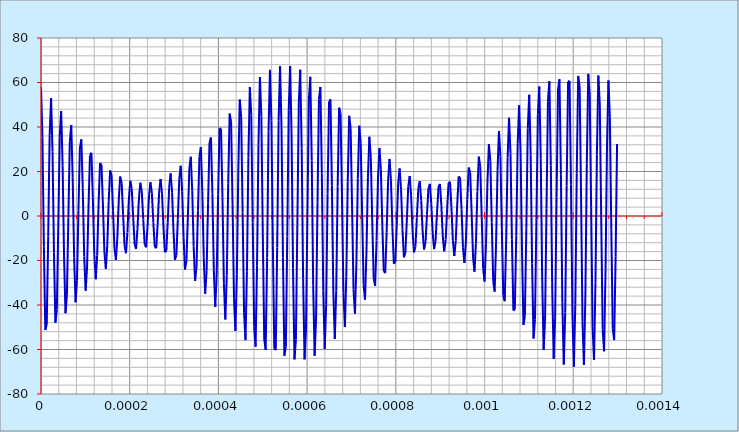
| Category | Series 0 |
|---|---|
| 0.0 | 58.016 |
| 3.246753246753247e-06 | 35.27 |
| 6.493506493506494e-06 | -13.831 |
| 9.74025974025974e-06 | -51.241 |
| 1.2987012987012988e-05 | -48.731 |
| 1.6233766233766234e-05 | -9.201 |
| 1.948051948051948e-05 | 36.301 |
| 2.272727272727273e-05 | 52.983 |
| 2.5974025974025975e-05 | 28.934 |
| 2.9220779220779218e-05 | -16.416 |
| 3.246753246753247e-05 | -47.975 |
| 3.571428571428572e-05 | -42.167 |
| 3.896103896103896e-05 | -4.539 |
| 4.220779220779221e-05 | 35.343 |
| 4.545454545454546e-05 | 47.134 |
| 4.87012987012987e-05 | 22.808 |
| 5.194805194805195e-05 | -17.971 |
| 5.51948051948052e-05 | -43.721 |
| 5.8441558441558436e-05 | -35.454 |
| 6.168831168831169e-05 | -0.658 |
| 6.493506493506494e-05 | 33.341 |
| 6.818181818181818e-05 | 40.838 |
| 7.142857142857143e-05 | 17.176 |
| 7.467532467532468e-05 | -18.529 |
| 7.792207792207792e-05 | -38.8 |
| 8.116883116883117e-05 | -28.945 |
| 8.441558441558442e-05 | 2.344 |
| 8.766233766233767e-05 | 30.534 |
| 9.090909090909092e-05 | 34.477 |
| 9.415584415584415e-05 | 12.254 |
| 9.74025974025974e-05 | -18.213 |
| 0.00010064935064935065 | -33.578 |
| 0.0001038961038961039 | -22.948 |
| 0.00010714285714285715 | 4.466 |
| 0.0001103896103896104 | 27.226 |
| 0.00011363636363636362 | 28.414 |
| 0.00011688311688311687 | 8.169 |
| 0.00012012987012987012 | -17.233 |
| 0.00012337662337662337 | -28.43 |
| 0.00012662337662337663 | -17.7 |
| 0.00012987012987012987 | 5.798 |
| 0.0001331168831168831 | 23.76 |
| 0.00013636363636363637 | 22.964 |
| 0.0001396103896103896 | 4.956 |
| 0.00014285714285714287 | -15.864 |
| 0.0001461038961038961 | -23.711 |
| 0.00014935064935064937 | -13.35 |
| 0.00015259740259740258 | 6.518 |
| 0.00015584415584415584 | 20.492 |
| 0.00015909090909090907 | 18.372 |
| 0.00016233766233766234 | 2.55 |
| 0.0001655844155844156 | -14.418 |
| 0.00016883116883116884 | -19.73 |
| 0.0001720779220779221 | -9.95 |
| 0.00017532467532467534 | 6.866 |
| 0.0001785714285714286 | 17.755 |
| 0.00018181818181818183 | 14.792 |
| 0.00018506493506493504 | 0.804 |
| 0.0001883116883116883 | -13.222 |
| 0.00019155844155844154 | -16.72 |
| 0.0001948051948051948 | -7.454 |
| 0.00019805194805194804 | 7.128 |
| 0.0002012987012987013 | 15.837 |
| 0.00020454545454545454 | 12.279 |
| 0.0002077922077922078 | -0.502 |
| 0.00021103896103896104 | -12.584 |
| 0.0002142857142857143 | -14.825 |
| 0.00021753246753246754 | -5.725 |
| 0.0002207792207792208 | 7.602 |
| 0.000224025974025974 | 14.95 |
| 0.00022727272727272725 | 10.783 |
| 0.0002305194805194805 | -1.631 |
| 0.00023376623376623374 | -12.764 |
| 0.000237012987012987 | -14.084 |
| 0.00024025974025974024 | -4.552 |
| 0.0002435064935064935 | 8.574 |
| 0.00024675324675324674 | 15.216 |
| 0.00025 | 10.164 |
| 0.00025324675324675327 | -2.871 |
| 0.00025649350649350653 | -13.951 |
| 0.00025974025974025974 | -14.435 |
| 0.000262987012987013 | -3.672 |
| 0.0002662337662337662 | 10.284 |
| 0.0002694805194805195 | 16.652 |
| 0.00027272727272727274 | 10.2 |
| 0.00027597402597402595 | -4.495 |
| 0.0002792207792207792 | -16.245 |
| 0.00028246753246753247 | -15.715 |
| 0.00028571428571428574 | -2.797 |
| 0.00028896103896103894 | 12.909 |
| 0.0002922077922077922 | 19.173 |
| 0.00029545454545454547 | 10.614 |
| 0.00029870129870129873 | -6.743 |
| 0.00030194805194805194 | -19.645 |
| 0.00030519480519480515 | -17.683 |
| 0.0003084415584415584 | -1.642 |
| 0.0003116883116883117 | 16.535 |
| 0.00031493506493506494 | 22.592 |
| 0.00031818181818181815 | 11.099 |
| 0.0003214285714285714 | -9.789 |
| 0.0003246753246753247 | -24.045 |
| 0.00032792207792207794 | -20.035 |
| 0.0003311688311688312 | 0.043 |
| 0.0003344155844155844 | 21.153 |
| 0.00033766233766233767 | 26.644 |
| 0.00034090909090909094 | 11.346 |
| 0.0003441558441558442 | -13.726 |
| 0.0003474025974025974 | -29.243 |
| 0.00035064935064935067 | -22.436 |
| 0.00035389610389610393 | 2.452 |
| 0.0003571428571428572 | 26.653 |
| 0.0003603896103896104 | 31.001 |
| 0.00036363636363636367 | 11.078 |
| 0.0003668831168831168 | -18.554 |
| 0.0003701298701298701 | -34.956 |
| 0.00037337662337662335 | -24.549 |
| 0.0003766233766233766 | 5.7 |
| 0.0003798701298701298 | 32.83 |
| 0.0003831168831168831 | 35.3 |
| 0.00038636363636363635 | 10.07 |
| 0.0003896103896103896 | -24.176 |
| 0.0003928571428571428 | -40.84 |
| 0.0003961038961038961 | -26.063 |
| 0.00039935064935064934 | 9.812 |
| 0.0004025974025974026 | 39.4 |
| 0.00040584415584415587 | 39.179 |
| 0.0004090909090909091 | 8.176 |
| 0.00041233766233766234 | -30.4 |
| 0.0004155844155844156 | -46.521 |
| 0.00041883116883116887 | -26.721 |
| 0.0004220779220779221 | 14.717 |
| 0.00042532467532467534 | 46.02 |
| 0.0004285714285714286 | 42.3 |
| 0.00043181818181818187 | 5.337 |
| 0.0004350649350649351 | -36.957 |
| 0.00043831168831168834 | -51.619 |
| 0.0004415584415584416 | -26.344 |
| 0.00044480519480519486 | 20.249 |
| 0.000448051948051948 | 52.315 |
| 0.0004512987012987013 | 44.383 |
| 0.0004545454545454545 | 1.593 |
| 0.00045779220779220775 | -43.521 |
| 0.000461038961038961 | -55.787 |
| 0.0004642857142857143 | -24.843 |
| 0.0004675324675324675 | 26.168 |
| 0.00047077922077922075 | 57.91 |
| 0.000474025974025974 | 45.223 |
| 0.0004772727272727273 | -2.925 |
| 0.0004805194805194805 | -49.733 |
| 0.00048376623376623375 | -58.731 |
| 0.000487012987012987 | -22.228 |
| 0.0004902597402597403 | 32.171 |
| 0.0004935064935064935 | 62.459 |
| 0.0004967532467532468 | 44.712 |
| 0.0005 | -8.001 |
| 0.0005032467532467532 | -55.232 |
| 0.0005064935064935065 | -60.24 |
| 0.0005097402597402597 | -18.605 |
| 0.0005129870129870131 | 37.923 |
| 0.0005162337662337663 | 65.673 |
| 0.0005194805194805195 | 42.842 |
| 0.0005227272727272728 | -13.358 |
| 0.000525974025974026 | -59.687 |
| 0.0005292207792207792 | -60.197 |
| 0.0005324675324675324 | -14.17 |
| 0.0005357142857142856 | 43.081 |
| 0.000538961038961039 | 67.345 |
| 0.0005422077922077922 | 39.707 |
| 0.0005454545454545455 | -18.681 |
| 0.0005487012987012987 | -62.819 |
| 0.0005519480519480519 | -58.593 |
| 0.0005551948051948052 | -9.182 |
| 0.0005584415584415584 | 47.331 |
| 0.0005616883116883116 | 67.363 |
| 0.0005649350649350649 | 35.494 |
| 0.0005681818181818182 | -23.643 |
| 0.0005714285714285715 | -64.435 |
| 0.0005746753246753247 | -55.522 |
| 0.0005779220779220779 | -3.951 |
| 0.0005811688311688312 | 50.407 |
| 0.0005844155844155844 | 65.726 |
| 0.0005876623376623377 | 30.463 |
| 0.0005909090909090909 | -27.937 |
| 0.0005941558441558441 | -64.432 |
| 0.0005974025974025975 | -51.176 |
| 0.0006006493506493507 | 1.203 |
| 0.0006038961038961039 | 52.123 |
| 0.0006071428571428572 | 62.539 |
| 0.0006103896103896103 | 24.924 |
| 0.0006136363636363636 | -31.303 |
| 0.0006168831168831168 | -62.82 |
| 0.0006201298701298701 | -45.825 |
| 0.0006233766233766234 | 5.967 |
| 0.0006266233766233766 | 52.385 |
| 0.0006298701298701299 | 58.003 |
| 0.0006331168831168831 | 19.211 |
| 0.0006363636363636363 | -33.552 |
| 0.0006396103896103896 | -59.71 |
| 0.0006428571428571428 | -39.792 |
| 0.0006461038961038961 | 10.072 |
| 0.0006493506493506494 | 51.201 |
| 0.0006525974025974026 | 52.401 |
| 0.0006558441558441559 | 13.651 |
| 0.000659090909090909 | -34.582 |
| 0.0006623376623376624 | -55.314 |
| 0.0006655844155844155 | -33.431 |
| 0.0006688311688311688 | 13.314 |
| 0.000672077922077922 | 48.684 |
| 0.0006753246753246753 | 46.076 |
| 0.0006785714285714286 | 8.535 |
| 0.0006818181818181819 | -34.393 |
| 0.000685064935064935 | -49.923 |
| 0.0006883116883116884 | -27.091 |
| 0.0006915584415584415 | 15.57 |
| 0.0006948051948051948 | 45.043 |
| 0.000698051948051948 | 39.396 |
| 0.0007012987012987013 | 4.093 |
| 0.0007045454545454546 | -33.081 |
| 0.0007077922077922079 | -43.887 |
| 0.000711038961038961 | -21.088 |
| 0.0007142857142857144 | 16.815 |
| 0.0007175324675324675 | 40.565 |
| 0.0007207792207792208 | 32.732 |
| 0.000724025974025974 | 0.477 |
| 0.0007272727272727273 | -30.838 |
| 0.0007305194805194805 | -37.585 |
| 0.0007337662337662336 | -15.683 |
| 0.0007370129870129871 | 17.12 |
| 0.0007402597402597402 | 35.593 |
| 0.0007435064935064935 | 26.42 |
| 0.0007467532467532467 | -2.255 |
| 0.00075 | -27.933 |
| 0.0007532467532467532 | -31.393 |
| 0.0007564935064935065 | -11.056 |
| 0.0007597402597402596 | 16.645 |
| 0.0007629870129870131 | 30.499 |
| 0.0007662337662337662 | 20.742 |
| 0.0007694805194805195 | -4.14 |
| 0.0007727272727272727 | -24.686 |
| 0.000775974025974026 | -25.657 |
| 0.0007792207792207792 | -7.296 |
| 0.0007824675324675325 | 15.627 |
| 0.0007857142857142856 | 25.653 |
| 0.0007889610389610391 | 15.899 |
| 0.0007922077922077922 | -5.305 |
| 0.0007954545454545455 | -21.449 |
| 0.0007987012987012987 | -20.664 |
| 0.000801948051948052 | -4.395 |
| 0.0008051948051948052 | 14.36 |
| 0.0008084415584415585 | 21.39 |
| 0.0008116883116883117 | 11.999 |
| 0.0008149350649350648 | -5.955 |
| 0.0008181818181818182 | -18.569 |
| 0.0008214285714285714 | -16.62 |
| 0.0008246753246753247 | -2.254 |
| 0.0008279220779220779 | 13.162 |
| 0.0008311688311688312 | 17.988 |
| 0.0008344155844155843 | 9.05 |
| 0.0008376623376623377 | -6.352 |
| 0.0008409090909090908 | -16.359 |
| 0.0008441558441558442 | -13.635 |
| 0.0008474025974025974 | -0.692 |
| 0.0008506493506493507 | 12.353 |
| 0.0008538961038961039 | 15.641 |
| 0.0008571428571428572 | 6.966 |
| 0.0008603896103896103 | -6.787 |
| 0.0008636363636363637 | -15.075 |
| 0.0008668831168831168 | -11.716 |
| 0.0008701298701298702 | 0.532 |
| 0.0008733766233766234 | 12.221 |
| 0.0008766233766233767 | 14.444 |
| 0.0008798701298701299 | 5.575 |
| 0.0008831168831168832 | -7.557 |
| 0.0008863636363636363 | -14.888 |
| 0.0008896103896103897 | -10.773 |
| 0.0008928571428571428 | 1.696 |
| 0.000896103896103896 | 12.996 |
| 0.0008993506493506494 | 14.391 |
| 0.0009025974025974026 | 4.639 |
| 0.0009058441558441559 | -8.929 |
| 0.000909090909090909 | -15.873 |
| 0.0009123376623376624 | -10.625 |
| 0.0009155844155844155 | 3.082 |
| 0.0009188311688311688 | 14.827 |
| 0.000922077922077922 | 15.371 |
| 0.0009253246753246754 | 3.88 |
| 0.0009285714285714286 | -11.116 |
| 0.0009318181818181819 | -17.999 |
| 0.000935064935064935 | -11.02 |
| 0.0009383116883116884 | 4.954 |
| 0.0009415584415584415 | 17.769 |
| 0.0009448051948051948 | 17.183 |
| 0.000948051948051948 | 3.006 |
| 0.0009512987012987013 | -14.256 |
| 0.0009545454545454546 | -21.134 |
| 0.0009577922077922079 | -11.662 |
| 0.000961038961038961 | 7.526 |
| 0.0009642857142857144 | 21.773 |
| 0.0009675324675324675 | 19.551 |
| 0.0009707792207792208 | 1.742 |
| 0.000974025974025974 | -18.395 |
| 0.0009772727272727272 | -25.051 |
| 0.0009805194805194806 | -12.239 |
| 0.0009837662337662337 | 10.939 |
| 0.000987012987012987 | 26.688 |
| 0.0009902597402597403 | 22.153 |
| 0.0009935064935064936 | -0.142 |
| 0.0009967532467532467 | -23.48 |
| 0.001 | -29.452 |
| 0.0010032467532467531 | -12.448 |
| 0.0010064935064935064 | 15.248 |
| 0.0010097402597402598 | 32.274 |
| 0.001012987012987013 | 24.646 |
| 0.0010162337662337662 | -2.81 |
| 0.0010194805194805195 | -29.356 |
| 0.0010227272727272726 | -33.989 |
| 0.0010259740259740261 | -12.029 |
| 0.0010292207792207792 | 20.412 |
| 0.0010324675324675325 | 38.216 |
| 0.0010357142857142856 | 26.697 |
| 0.001038961038961039 | -6.34 |
| 0.0010422077922077923 | -35.784 |
| 0.0010454545454545456 | -38.293 |
| 0.0010487012987012987 | -10.788 |
| 0.001051948051948052 | 26.291 |
| 0.0010551948051948051 | 44.154 |
| 0.0010584415584415584 | 28.016 |
| 0.0010616883116883117 | -10.719 |
| 0.0010649350649350648 | -42.45 |
| 0.0010681818181818182 | -42.008 |
| 0.0010714285714285713 | -8.612 |
| 0.0010746753246753248 | 32.662 |
| 0.001077922077922078 | 49.706 |
| 0.0010811688311688312 | 28.373 |
| 0.0010844155844155843 | -15.835 |
| 0.0010876623376623376 | -48.995 |
| 0.001090909090909091 | -44.815 |
| 0.0010941558441558443 | -5.482 |
| 0.0010974025974025974 | 39.228 |
| 0.0011006493506493507 | 54.503 |
| 0.0011038961038961038 | 27.625 |
| 0.001107142857142857 | -21.491 |
| 0.0011103896103896104 | -55.041 |
| 0.0011136363636363637 | -46.465 |
| 0.0011168831168831168 | -1.478 |
| 0.0011201298701298702 | 45.647 |
| 0.0011233766233766233 | 58.217 |
| 0.0011266233766233768 | 25.724 |
| 0.0011298701298701299 | -27.417 |
| 0.0011331168831168832 | -60.224 |
| 0.0011363636363636363 | -46.792 |
| 0.0011396103896103896 | 3.233 |
| 0.001142857142857143 | 51.557 |
| 0.001146103896103896 | 60.589 |
| 0.0011493506493506494 | 22.723 |
| 0.0011525974025974025 | -33.297 |
| 0.0011558441558441558 | -64.219 |
| 0.001159090909090909 | -45.731 |
| 0.0011623376623376624 | 8.409 |
| 0.0011655844155844155 | 56.609 |
| 0.0011688311688311688 | 61.447 |
| 0.001172077922077922 | 18.765 |
| 0.0011753246753246755 | -38.789 |
| 0.0011785714285714286 | -66.772 |
| 0.0011818181818181819 | -43.318 |
| 0.001185064935064935 | 13.753 |
| 0.0011883116883116883 | 60.493 |
| 0.0011915584415584416 | 60.722 |
| 0.001194805194805195 | 14.078 |
| 0.001198051948051948 | -43.561 |
| 0.0012012987012987014 | -67.718 |
| 0.0012045454545454545 | -39.692 |
| 0.0012077922077922078 | 18.942 |
| 0.001211038961038961 | 62.966 |
| 0.0012142857142857144 | 58.452 |
| 0.0012175324675324675 | 8.945 |
| 0.0012207792207792206 | -47.319 |
| 0.0012240259740259741 | -66.994 |
| 0.0012272727272727272 | -35.072 |
| 0.0012305194805194806 | 23.655 |
| 0.0012337662337662337 | 63.875 |
| 0.001237012987012987 | 54.775 |
| 0.0012402597402597403 | 3.684 |
| 0.0012435064935064936 | -49.83 |
| 0.0012467532467532467 | -64.647 |
| 0.00125 | -29.745 |
| 0.0012532467532467531 | 27.604 |
| 0.0012564935064935064 | 63.167 |
| 0.0012597402597402598 | 49.922 |
| 0.001262987012987013 | -1.383 |
| 0.0012662337662337662 | -50.946 |
| 0.0012694805194805195 | -60.827 |
| 0.0012727272727272726 | -24.037 |
| 0.0012759740259740261 | 30.554 |
| 0.0012792207792207792 | 60.896 |
| 0.0012824675324675325 | 44.192 |
| 0.0012857142857142856 | -5.96 |
| 0.001288961038961039 | -50.618 |
| 0.0012922077922077923 | -55.776 |
| 0.0012954545454545456 | -18.284 |
| 0.0012987012987012987 | 32.355 |